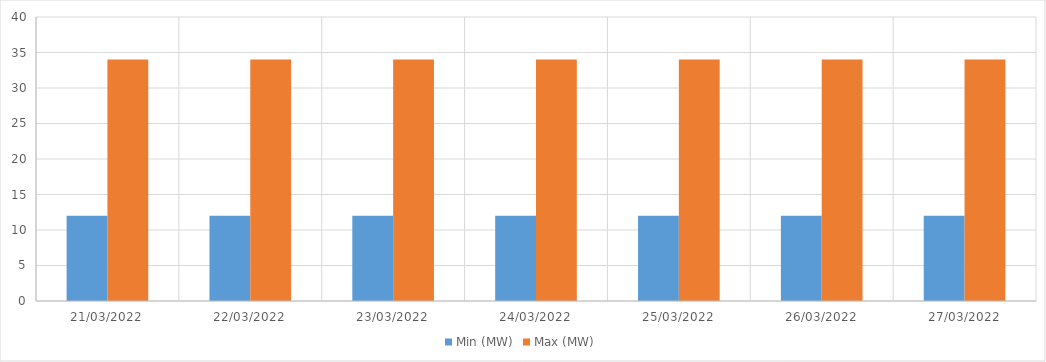
| Category | Min (MW) | Max (MW) |
|---|---|---|
| 21/03/2022 | 12 | 34 |
| 22/03/2022 | 12 | 34 |
| 23/03/2022 | 12 | 34 |
| 24/03/2022 | 12 | 34 |
| 25/03/2022 | 12 | 34 |
| 26/03/2022 | 12 | 34 |
| 27/03/2022 | 12 | 34 |